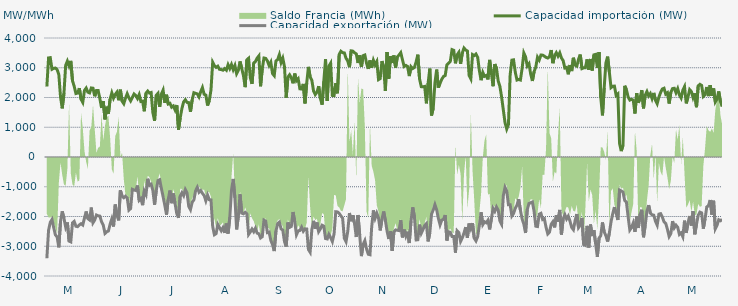
| Category | Capacidad importación (MW) | Capacidad exportación (MW) |
|---|---|---|
| 0 | 2368.375 | -3404.167 |
| 1900-01-01 | 3329.75 | -2465.083 |
| 1900-01-02 | 3339.208 | -2197.25 |
| 1900-01-03 | 2948.5 | -2100.583 |
| 1900-01-04 | 2980.792 | -2371.042 |
| 1900-01-05 | 2990.708 | -2620.708 |
| 1900-01-06 | 2938.333 | -2683 |
| 1900-01-07 | 2774.542 | -3036.75 |
| 1900-01-08 | 2014.917 | -2156.292 |
| 1900-01-09 | 1635.417 | -1825.292 |
| 1900-01-10 | 2140.25 | -2060.75 |
| 1900-01-11 | 3080.917 | -2353.125 |
| 1900-01-12 | 3223.333 | -2199.083 |
| 1900-01-13 | 3058.083 | -2827.667 |
| 1900-01-14 | 3231.167 | -2853.292 |
| 1900-01-15 | 2562 | -2213.625 |
| 1900-01-16 | 2375 | -2164.25 |
| 1900-01-17 | 2133.333 | -2329.5 |
| 1900-01-18 | 2150 | -2341.083 |
| 1900-01-19 | 2314.583 | -2282 |
| 1900-01-20 | 1943.75 | -2242.25 |
| 1900-01-21 | 1835.625 | -2285.208 |
| 1900-01-22 | 2235.417 | -2055.542 |
| 1900-01-23 | 2316.667 | -1831.25 |
| 1900-01-24 | 2178.125 | -2071.583 |
| 1900-01-25 | 2154.167 | -2116.125 |
| 1900-01-26 | 2321.417 | -1699.458 |
| 1900-01-27 | 2312 | -2210.167 |
| 1900-01-28 | 2040.917 | -2118.083 |
| 1900-01-29 | 2233.083 | -1949.458 |
| 1900-01-30 | 2234.854 | -1977.083 |
| 1900-01-31 | 1964.583 | -1985.792 |
| 1900-02-01 | 1650 | -2177.417 |
| 1900-02-02 | 1877.083 | -2287.667 |
| 1900-02-03 | 1264.583 | -2568.708 |
| 1900-02-04 | 1691.667 | -2512.667 |
| 1900-02-05 | 1456.25 | -2486.333 |
| 1900-02-06 | 1945.833 | -2259.083 |
| 1900-02-07 | 2154.167 | -2079.5 |
| 1900-02-08 | 1979.167 | -2336.083 |
| 1900-02-09 | 2104.167 | -1597.917 |
| 1900-02-10 | 2179.167 | -1954.167 |
| 1900-02-11 | 1908.333 | -2131.25 |
| 1900-02-12 | 2262.5 | -1118.75 |
| 1900-02-13 | 1879.167 | -1314.583 |
| 1900-02-14 | 1791.667 | -1368 |
| 1900-02-15 | 1977.083 | -1316.667 |
| 1900-02-16 | 2127.083 | -1377.083 |
| 1900-02-17 | 1987.5 | -1785.417 |
| 1900-02-18 | 1887.5 | -1733.333 |
| 1900-02-19 | 2002.083 | -1085.417 |
| 1900-02-20 | 2118.75 | -1110.417 |
| 1900-02-21 | 2066.667 | -1125 |
| 1900-02-22 | 1966.667 | -958.333 |
| 1900-02-23 | 2097.917 | -1454.167 |
| 1900-02-24 | 1864.583 | -1397.917 |
| 1900-02-25 | 1877.083 | -1618.75 |
| 1900-02-26 | 1537.5 | -1143.75 |
| 1900-02-27 | 2145.833 | -1264 |
| 1900-02-28 | 2216.667 | -731.25 |
| 1900-02-28 | 2150 | -950 |
| 1900-03-01 | 2167.583 | -916.667 |
| 1900-03-02 | 1493.75 | -1122.25 |
| 1900-03-03 | 1220.833 | -1604.167 |
| 1900-03-04 | 2072.917 | -1125 |
| 1900-03-05 | 2139.583 | -791.667 |
| 1900-03-06 | 1687.5 | -764.583 |
| 1900-03-07 | 2116.667 | -1058.333 |
| 1900-03-08 | 2247.917 | -1337.5 |
| 1900-03-09 | 1818.75 | -1627.083 |
| 1900-03-10 | 2093.75 | -1937.5 |
| 1900-03-11 | 1781.25 | -1422.917 |
| 1900-03-12 | 1804.167 | -1127.083 |
| 1900-03-13 | 1675 | -1552.083 |
| 1900-03-14 | 1716.667 | -1225 |
| 1900-03-15 | 1583.333 | -1570.833 |
| 1900-03-16 | 1747.917 | -1904.167 |
| 1900-03-17 | 918.75 | -2042.875 |
| 1900-03-18 | 1314.583 | -1310.417 |
| 1900-03-19 | 1629.167 | -1200 |
| 1900-03-20 | 1852.083 | -1300.583 |
| 1900-03-21 | 1925 | -1095.833 |
| 1900-03-22 | 1835.417 | -1208.333 |
| 1900-03-23 | 1827.083 | -1656.25 |
| 1900-03-24 | 1522.917 | -1770.917 |
| 1900-03-25 | 1916.667 | -1518.75 |
| 1900-03-26 | 2160.417 | -1441.667 |
| 1900-03-27 | 2139.583 | -1137.5 |
| 1900-03-28 | 2120.833 | -1018.75 |
| 1900-03-29 | 2018.75 | -1183.333 |
| 1900-03-30 | 2193.75 | -1127.083 |
| 1900-03-31 | 2333.333 | -1220.833 |
| 1900-04-01 | 2108.333 | -1295.833 |
| 1900-04-02 | 2079.833 | -1472.917 |
| 1900-04-03 | 1729.167 | -1281.25 |
| 1900-04-04 | 1897.917 | -1434.542 |
| 1900-04-05 | 2247 | -1443.75 |
| 1900-04-06 | 3185.083 | -2337 |
| 1900-04-07 | 3075.167 | -2613.625 |
| 1900-04-08 | 3013.625 | -2576.5 |
| 1900-04-09 | 3052.042 | -2269.25 |
| 1900-04-10 | 2946.333 | -2370.833 |
| 1900-04-11 | 2940.542 | -2478.958 |
| 1900-04-12 | 2917.208 | -2375.625 |
| 1900-04-13 | 2971.167 | -2551.875 |
| 1900-04-14 | 2917.292 | -2238 |
| 1900-04-15 | 3101.958 | -2573.167 |
| 1900-04-16 | 2973.375 | -2041.667 |
| 1900-04-17 | 3109.875 | -1120.167 |
| 1900-04-18 | 2936.333 | -737.5 |
| 1900-04-19 | 3074.833 | -1371.667 |
| 1900-04-20 | 2802.417 | -2434.917 |
| 1900-04-21 | 2913.625 | -1996.875 |
| 1900-04-22 | 3212.125 | -1254.167 |
| 1900-04-23 | 2973 | -1887.5 |
| 1900-04-24 | 2732 | -1910.417 |
| 1900-04-25 | 2348.333 | -1858 |
| 1900-04-26 | 3266 | -1911.25 |
| 1900-04-27 | 3318.417 | -2603.917 |
| 1900-04-28 | 2666.292 | -2519.292 |
| 1900-04-29 | 2457.667 | -2420.375 |
| 1900-04-30 | 3159.917 | -2510.583 |
| 1900-05-01 | 3208.208 | -2395.833 |
| 1900-05-02 | 3322.042 | -2559.25 |
| 1900-05-03 | 3397.292 | -2579.208 |
| 1900-05-04 | 2377.292 | -2722 |
| 1900-05-05 | 2966.875 | -2678.583 |
| 1900-05-06 | 3327.583 | -2120.833 |
| 1900-05-07 | 3314.125 | -2154.167 |
| 1900-05-08 | 3229.625 | -2542.417 |
| 1900-05-09 | 3075.125 | -2524.125 |
| 1900-05-10 | 3186.833 | -2800.875 |
| 1900-05-11 | 2804.417 | -2944.208 |
| 1900-05-12 | 2733.75 | -3162.5 |
| 1900-05-13 | 3225.458 | -2491.042 |
| 1900-05-14 | 3275.667 | -2238.417 |
| 1900-05-15 | 3439.5 | -2190.417 |
| 1900-05-16 | 3175.292 | -2417.375 |
| 1900-05-17 | 3321.875 | -2458.417 |
| 1900-05-18 | 3034.917 | -2846.167 |
| 1900-05-19 | 1991.917 | -3010.667 |
| 1900-05-20 | 2685.833 | -2200.25 |
| 1900-05-21 | 2763.167 | -2365.208 |
| 1900-05-22 | 2664.875 | -2334.375 |
| 1900-05-23 | 2477.792 | -1849.417 |
| 1900-05-24 | 2804.25 | -2175.083 |
| 1900-05-25 | 2563.458 | -2614.833 |
| 1900-05-26 | 2629.917 | -2484.333 |
| 1900-05-27 | 2292 | -2469.792 |
| 1900-05-28 | 2284.542 | -2356.917 |
| 1900-05-29 | 2456.5 | -2494.792 |
| 1900-05-30 | 1801.792 | -2413.833 |
| 1900-05-31 | 2484.917 | -2419 |
| 1900-06-01 | 3029.417 | -3108.292 |
| 1900-06-02 | 2693.417 | -3201.125 |
| 1900-06-03 | 2579.5 | -2439 |
| 1900-06-04 | 2220.833 | -2146.167 |
| 1900-06-05 | 2100 | -2410.292 |
| 1900-06-06 | 2179.167 | -2202.083 |
| 1900-06-07 | 2381.25 | -2508.5 |
| 1900-06-08 | 1970.833 | -2414.375 |
| 1900-06-09 | 1758.333 | -2292.792 |
| 1900-06-10 | 2544 | -2324.083 |
| 1900-06-11 | 3285.125 | -2739.75 |
| 1900-06-12 | 1885.375 | -2754.917 |
| 1900-06-13 | 3057.958 | -2601 |
| 1900-06-14 | 3152.583 | -2708.375 |
| 1900-06-15 | 2068.833 | -2840.833 |
| 1900-06-16 | 2060.917 | -2586.417 |
| 1900-06-17 | 2484.25 | -1839.417 |
| 1900-06-18 | 2141.208 | -1845.833 |
| 1900-06-19 | 3445.375 | -1893.75 |
| 1900-06-20 | 3555.25 | -1979.583 |
| 1900-06-21 | 3506.875 | -2054.167 |
| 1900-06-22 | 3499.292 | -2730 |
| 1900-06-23 | 3321.917 | -2848.375 |
| 1900-06-24 | 3225.583 | -2505.583 |
| 1900-06-25 | 3019.583 | -1882.958 |
| 1900-06-26 | 3568.667 | -2157.833 |
| 1900-06-27 | 3559.375 | -1957.75 |
| 1900-06-28 | 3503.125 | -2252.375 |
| 1900-06-29 | 3464.458 | -2689.458 |
| 1900-06-30 | 3159.52 | -1949.52 |
| 1900-07-01 | 3414.875 | -2624.75 |
| 1900-07-02 | 3028.417 | -3331.875 |
| 1900-07-03 | 3406.833 | -2936.5 |
| 1900-07-04 | 3428.875 | -2811.25 |
| 1900-07-05 | 3154.208 | -3088.625 |
| 1900-07-06 | 2961.542 | -3268.083 |
| 1900-07-07 | 3246.75 | -3285.125 |
| 1900-07-08 | 2998.792 | -2359.333 |
| 1900-07-09 | 3250.625 | -1795.833 |
| 1900-07-10 | 3098.083 | -2058.458 |
| 1900-07-11 | 3208.458 | -1889.583 |
| 1900-07-12 | 2600.833 | -2050 |
| 1900-07-13 | 2636.458 | -2468.208 |
| 1900-07-14 | 3221.75 | -2100 |
| 1900-07-15 | 3030.917 | -1831.25 |
| 1900-07-16 | 2221.417 | -2127.083 |
| 1900-07-17 | 3529.833 | -2490.5 |
| 1900-07-18 | 2631.583 | -2756.25 |
| 1900-07-19 | 3389.417 | -2493.667 |
| 1900-07-20 | 3161.917 | -3158.375 |
| 1900-07-21 | 3412.417 | -2518.792 |
| 1900-07-22 | 3004.917 | -2450.333 |
| 1900-07-23 | 3360.75 | -2463.25 |
| 1900-07-24 | 3427.958 | -2474.292 |
| 1900-07-25 | 3506.917 | -2123.5 |
| 1900-07-26 | 3269.708 | -2701.708 |
| 1900-07-27 | 3043.333 | -2440.417 |
| 1900-07-28 | 3078.833 | -2660.667 |
| 1900-07-29 | 3042.542 | -2510.25 |
| 1900-07-30 | 2720.083 | -2892.208 |
| 1900-07-31 | 3035.792 | -2156.833 |
| 1900-08-01 | 2973.125 | -1691.667 |
| 1900-08-02 | 3008.708 | -2006.25 |
| 1900-08-03 | 3198.417 | -2788.271 |
| 1900-08-04 | 3439.5 | -2780.875 |
| 1900-08-05 | 2626.625 | -2273 |
| 1900-08-06 | 2364.583 | -2564.167 |
| 1900-08-07 | 2360.417 | -2440.708 |
| 1900-08-08 | 2372.917 | -2302.125 |
| 1900-08-09 | 1804.167 | -2241.25 |
| 1900-08-10 | 2476.875 | -2836.292 |
| 1900-08-11 | 2972.208 | -2552.292 |
| 1900-08-12 | 1394.917 | -1922 |
| 1900-08-13 | 1635.417 | -1780.667 |
| 1900-08-14 | 2487.208 | -1602.083 |
| 1900-08-15 | 2938.333 | -1770.833 |
| 1900-08-16 | 2333.708 | -2058.75 |
| 1900-08-17 | 2480.333 | -2280.5 |
| 1900-08-18 | 2612.458 | -2120.333 |
| 1900-08-19 | 2705.792 | -2095.25 |
| 1900-08-20 | 2735.375 | -1951.833 |
| 1900-08-21 | 3100.375 | -2807.583 |
| 1900-08-22 | 3154.125 | -2514.417 |
| 1900-08-23 | 3216.042 | -2530.208 |
| 1900-08-24 | 3609.167 | -2672.875 |
| 1900-08-25 | 3585.958 | -2674.5 |
| 1900-08-26 | 3148.417 | -3214.25 |
| 1900-08-27 | 3433.542 | -2480.667 |
| 1900-08-28 | 3518.5 | -2539.5 |
| 1900-08-29 | 3130.292 | -2838.583 |
| 1900-08-30 | 3499.167 | -2718.417 |
| 1900-08-31 | 3663.042 | -2554.083 |
| 1900-09-01 | 3596.708 | -2355.75 |
| 1900-09-02 | 3562.792 | -2716.417 |
| 1900-09-03 | 2738.75 | -2235.333 |
| 1900-09-04 | 2625.667 | -2410 |
| 1900-09-05 | 3444.083 | -2226.333 |
| 1900-09-06 | 3408.75 | -2728 |
| 1900-09-07 | 3460.583 | -2820.25 |
| 1900-09-08 | 3350.75 | -2676.083 |
| 1900-09-09 | 2899.917 | -2289.583 |
| 1900-09-10 | 2581.708 | -1858.083 |
| 1900-09-11 | 2842.042 | -2272.417 |
| 1900-09-12 | 2711.125 | -2177.417 |
| 1900-09-13 | 2740.458 | -2209.667 |
| 1900-09-14 | 2608.583 | -2127.083 |
| 1900-09-15 | 3264.042 | -2433.083 |
| 1900-09-16 | 2836.375 | -2085.417 |
| 1900-09-17 | 2379.792 | -1727.083 |
| 1900-09-18 | 3123.25 | -1827.083 |
| 1900-09-19 | 2982.792 | -1681.25 |
| 1900-09-20 | 2556.667 | -1789.667 |
| 1900-09-21 | 2375.667 | -2149.333 |
| 1900-09-22 | 2017.208 | -2261.458 |
| 1900-09-23 | 1585 | -1297.917 |
| 1900-09-24 | 1154.167 | -1022.917 |
| 1900-09-25 | 939.583 | -1143.75 |
| 1900-09-26 | 1093.75 | -1604.167 |
| 1900-09-27 | 2763.333 | -1604.167 |
| 1900-09-28 | 3256.375 | -1980.875 |
| 1900-09-29 | 3265.958 | -1897.917 |
| 1900-09-30 | 2849.625 | -1726.333 |
| 1900-10-01 | 2586.542 | -1614.583 |
| 1900-10-02 | 2607.375 | -1416.667 |
| 1900-10-03 | 2587.208 | -1789.583 |
| 1900-10-04 | 2978.5 | -2081.25 |
| 1900-10-05 | 3497.083 | -2256.292 |
| 1900-10-06 | 3370 | -2554.542 |
| 1900-10-07 | 3061.75 | -1771.917 |
| 1900-10-08 | 3134.875 | -1562.5 |
| 1900-10-09 | 2789.5 | -1537.5 |
| 1900-10-10 | 2555.75 | -1512.5 |
| 1900-10-11 | 2867.083 | -1825 |
| 1900-10-12 | 3026.833 | -2326.458 |
| 1900-10-13 | 3354.833 | -2337.292 |
| 1900-10-14 | 3258.292 | -1924.167 |
| 1900-10-15 | 3426.125 | -1893.75 |
| 1900-10-16 | 3424.167 | -2100 |
| 1900-10-17 | 3391.208 | -2070.833 |
| 1900-10-18 | 3348.208 | -2362.208 |
| 1900-10-19 | 3325.958 | -2584.917 |
| 1900-10-20 | 3372.292 | -2526.125 |
| 1900-10-21 | 3594.458 | -2261.833 |
| 1900-10-22 | 3154.208 | -2177.542 |
| 1900-10-23 | 3406.542 | -2366 |
| 1900-10-24 | 3506.792 | -1962 |
| 1900-10-25 | 3388.292 | -2170.833 |
| 1900-10-26 | 3502.625 | -1778.917 |
| 1900-10-27 | 3329.875 | -2606.583 |
| 1900-10-28 | 3238.958 | -2081.917 |
| 1900-10-29 | 2990.542 | -1937.25 |
| 1900-10-30 | 3009.542 | -2084.208 |
| 1900-10-31 | 2780.333 | -1987.25 |
| 1900-11-01 | 3090.792 | -2157.25 |
| 1900-11-02 | 2889.375 | -2369.167 |
| 1900-11-03 | 3335.375 | -2443.917 |
| 1900-11-04 | 3086.625 | -2135.417 |
| 1900-11-05 | 3054 | -1916.417 |
| 1900-11-06 | 3285.417 | -2373 |
| 1900-11-07 | 3443.292 | -2289.333 |
| 1900-11-08 | 2971.208 | -2047.917 |
| 1900-11-09 | 2996.292 | -2944.458 |
| 1900-11-10 | 3001.167 | -2971.542 |
| 1900-11-11 | 3281.375 | -2314.833 |
| 1900-11-12 | 2936.042 | -3043.167 |
| 1900-11-13 | 3294.792 | -2270.333 |
| 1900-11-14 | 2907.375 | -2657.667 |
| 1900-11-15 | 3433.583 | -2462.5 |
| 1900-11-16 | 3449.042 | -2914.583 |
| 1900-11-17 | 2992.458 | -3358.458 |
| 1900-11-18 | 3524.375 | -2728.208 |
| 1900-11-19 | 2000 | -2643.375 |
| 1900-11-20 | 1400 | -2200 |
| 1900-11-21 | 2323.375 | -2514.75 |
| 1900-11-22 | 3160.167 | -2645.333 |
| 1900-11-23 | 3372.083 | -2842.167 |
| 1900-11-24 | 2865.739 | -2564.565 |
| 1900-11-25 | 2332.667 | -2181.833 |
| 1900-11-26 | 2376.083 | -1906.25 |
| 1900-11-27 | 2381.25 | -1683.333 |
| 1900-11-28 | 2070.833 | -1891.667 |
| 1900-11-29 | 2120.083 | -2118.75 |
| 1900-11-30 | 449.25 | -1108.333 |
| 1900-12-01 | 200 | -1139.583 |
| 1900-12-02 | 395.833 | -1179.167 |
| 1900-12-03 | 2393.75 | -1462.5 |
| 1900-12-04 | 2262.25 | -1512.5 |
| 1900-12-05 | 2020.833 | -2007.167 |
| 1900-12-06 | 1912.5 | -2455.208 |
| 1900-12-07 | 1939.583 | -2371.125 |
| 1900-12-08 | 1908.333 | -2217.958 |
| 1900-12-09 | 1462.5 | -2517.542 |
| 1900-12-10 | 2145.208 | -2000.417 |
| 1900-12-11 | 1820.833 | -2386.167 |
| 1900-12-12 | 1983.333 | -1930.75 |
| 1900-12-13 | 2245.833 | -1772.917 |
| 1900-12-14 | 1635.417 | -2697.5 |
| 1900-12-15 | 2079.167 | -2299.625 |
| 1900-12-16 | 2200 | -1818.75 |
| 1900-12-17 | 2052.083 | -1616.667 |
| 1900-12-18 | 2133.333 | -1885.417 |
| 1900-12-19 | 1962.5 | -1940.792 |
| 1900-12-20 | 2154.167 | -1955.875 |
| 1900-12-21 | 1906.25 | -2160.458 |
| 1900-12-22 | 1791.667 | -2289.583 |
| 1900-12-23 | 2014.583 | -1920.333 |
| 1900-12-24 | 2166.667 | -1904.167 |
| 1900-12-25 | 2285.417 | -2016.25 |
| 1900-12-26 | 2310.417 | -2177.917 |
| 1900-12-27 | 2114.583 | -2230.875 |
| 1900-12-28 | 2160.417 | -2431.625 |
| 1900-12-29 | 1797.917 | -2674.417 |
| 1900-12-30 | 2180.625 | -2574 |
| 1900-12-31 | 2300 | -2155.333 |
| 1901-01-01 | 2310.417 | -2380.708 |
| 1901-01-02 | 2160.417 | -2290.5 |
| 1901-01-03 | 2295.833 | -2360.958 |
| 1901-01-04 | 2083.333 | -2603 |
| 1901-01-05 | 1983.333 | -2551.458 |
| 1901-01-06 | 2243.75 | -2680.375 |
| 1901-01-07 | 2364.583 | -2139.583 |
| 1901-01-08 | 1802.083 | -2551.375 |
| 1901-01-09 | 2012.5 | -2222.583 |
| 1901-01-10 | 2264.583 | -1983.333 |
| 1901-01-11 | 2200 | -2304.167 |
| 1901-01-12 | 1991.667 | -1823 |
| 1901-01-13 | 2139.583 | -2598.667 |
| 1901-01-14 | 1674.583 | -2262.5 |
| 1901-01-15 | 2391.667 | -1958.333 |
| 1901-01-16 | 2442.875 | -1852.083 |
| 1901-01-17 | 2406.25 | -1879.167 |
| 1901-01-18 | 2035.417 | -2408.5 |
| 1901-01-19 | 2093.75 | -2077.083 |
| 1901-01-20 | 2353.042 | -1679.167 |
| 1901-01-21 | 2047.917 | -1637.5 |
| 1901-01-22 | 2414.917 | -1445.833 |
| 1901-01-23 | 2054.167 | -1935.417 |
| 1901-01-24 | 2304.167 | -1468.75 |
| 1901-01-25 | 1852.083 | -2413.583 |
| 1901-01-26 | 1950 | -2298.583 |
| 1901-01-27 | 2204.167 | -2108.333 |
| 1901-01-28 | 1870.833 | -2142.875 |
| 1901-01-29 | 1693.75 | -2094.083 |